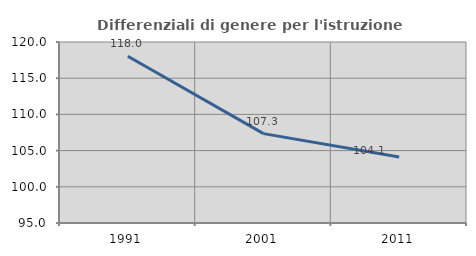
| Category | Differenziali di genere per l'istruzione superiore |
|---|---|
| 1991.0 | 118.038 |
| 2001.0 | 107.346 |
| 2011.0 | 104.104 |